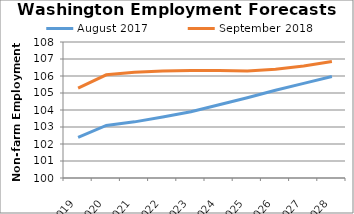
| Category | August 2017 | September 2018 |
|---|---|---|
| 2019.0 | 102.394 | 105.281 |
| 2020.0 | 103.09 | 106.07 |
| 2021.0 | 103.303 | 106.226 |
| 2022.0 | 103.587 | 106.289 |
| 2023.0 | 103.902 | 106.318 |
| 2024.0 | 104.309 | 106.323 |
| 2025.0 | 104.724 | 106.297 |
| 2026.0 | 105.164 | 106.391 |
| 2027.0 | 105.568 | 106.584 |
| 2028.0 | 105.975 | 106.851 |